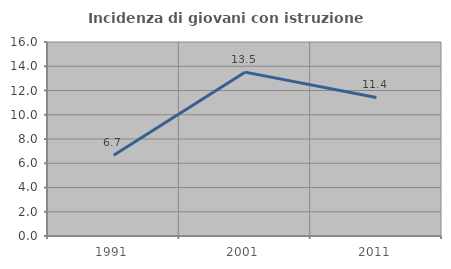
| Category | Incidenza di giovani con istruzione universitaria |
|---|---|
| 1991.0 | 6.667 |
| 2001.0 | 13.514 |
| 2011.0 | 11.429 |